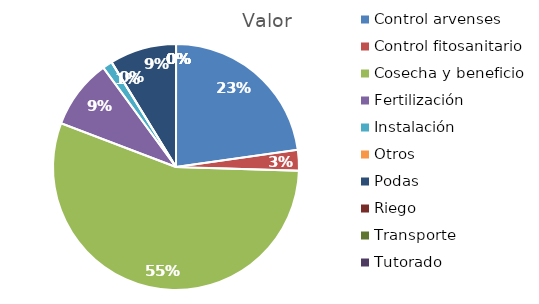
| Category | Valor |
|---|---|
| Control arvenses | 23190688 |
| Control fitosanitario | 2759232 |
| Cosecha y beneficio | 56355000 |
| Fertilización | 9328832 |
| Instalación | 1313920 |
| Otros | 0 |
| Podas | 8934656 |
| Riego | 0 |
| Transporte | 0 |
| Tutorado | 0 |